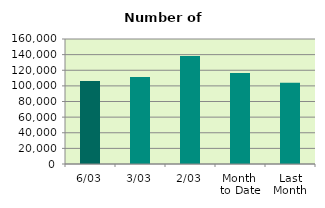
| Category | Series 0 |
|---|---|
| 6/03 | 106392 |
| 3/03 | 111350 |
| 2/03 | 138204 |
| Month 
to Date | 116532 |
| Last
Month | 103910.7 |